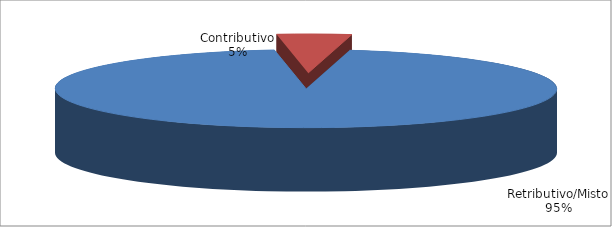
| Category | Series 1 |
|---|---|
| Retributivo/Misto | 268543 |
| Contributivo | 13511 |